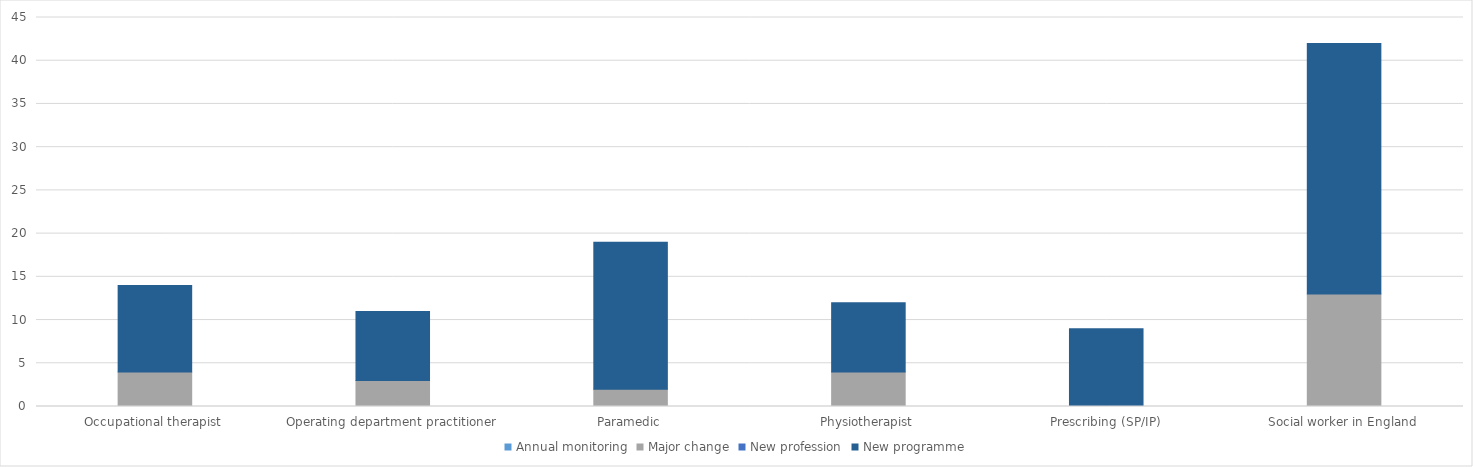
| Category | Annual monitoring | Major change | New profession | New programme |
|---|---|---|---|---|
| Occupational therapist | 0 | 4 | 0 | 10 |
| Operating department practitioner | 0 | 3 | 0 | 8 |
| Paramedic | 0 | 2 | 0 | 17 |
| Physiotherapist | 0 | 4 | 0 | 8 |
| Prescribing (SP/IP) | 0 | 0 | 0 | 9 |
| Social worker in England | 0 | 13 | 0 | 29 |